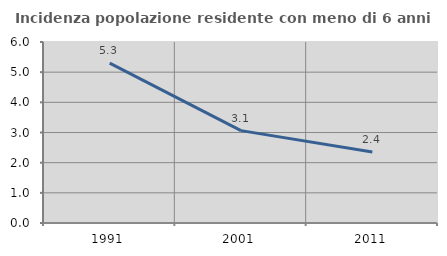
| Category | Incidenza popolazione residente con meno di 6 anni |
|---|---|
| 1991.0 | 5.301 |
| 2001.0 | 3.062 |
| 2011.0 | 2.351 |